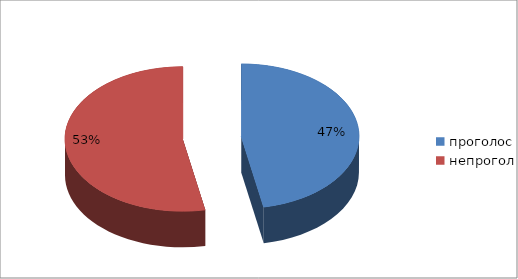
| Category | Series 0 |
|---|---|
| проголос | 23 |
| непрогол | 26 |